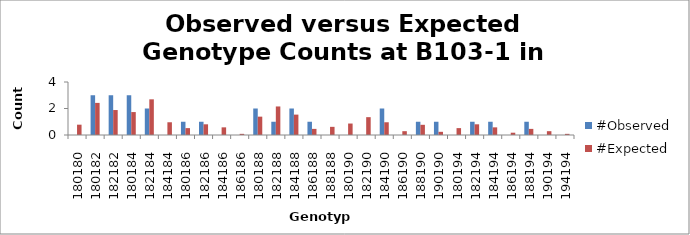
| Category | #Observed | #Expected |
|---|---|---|
| 180180.0 | 0 | 0.779 |
| 180182.0 | 3 | 2.423 |
| 182182.0 | 3 | 1.885 |
| 180184.0 | 3 | 1.731 |
| 182184.0 | 2 | 2.692 |
| 184184.0 | 0 | 0.962 |
| 180186.0 | 1 | 0.519 |
| 182186.0 | 1 | 0.808 |
| 184186.0 | 0 | 0.577 |
| 186186.0 | 0 | 0.087 |
| 180188.0 | 2 | 1.385 |
| 182188.0 | 1 | 2.154 |
| 184188.0 | 2 | 1.538 |
| 186188.0 | 1 | 0.462 |
| 188188.0 | 0 | 0.615 |
| 180190.0 | 0 | 0.865 |
| 182190.0 | 0 | 1.346 |
| 184190.0 | 2 | 0.962 |
| 186190.0 | 0 | 0.288 |
| 188190.0 | 1 | 0.769 |
| 190190.0 | 1 | 0.24 |
| 180194.0 | 0 | 0.519 |
| 182194.0 | 1 | 0.808 |
| 184194.0 | 1 | 0.577 |
| 186194.0 | 0 | 0.173 |
| 188194.0 | 1 | 0.462 |
| 190194.0 | 0 | 0.288 |
| 194194.0 | 0 | 0.087 |